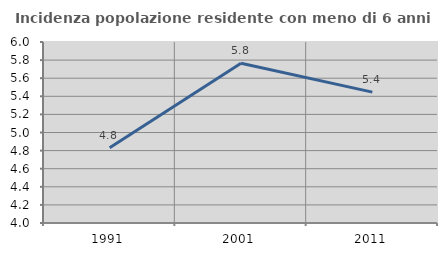
| Category | Incidenza popolazione residente con meno di 6 anni |
|---|---|
| 1991.0 | 4.832 |
| 2001.0 | 5.765 |
| 2011.0 | 5.446 |